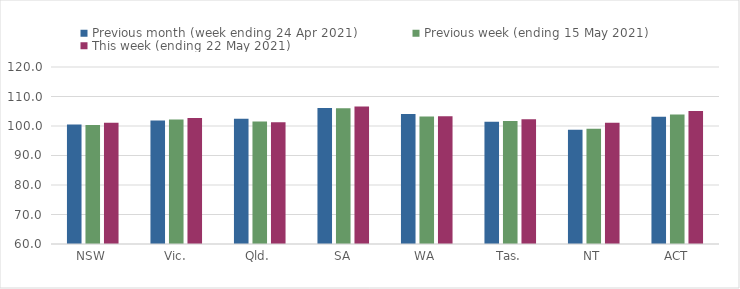
| Category | Previous month (week ending 24 Apr 2021) | Previous week (ending 15 May 2021) | This week (ending 22 May 2021) |
|---|---|---|---|
| NSW | 100.48 | 100.33 | 101.13 |
| Vic. | 101.85 | 102.24 | 102.7 |
| Qld. | 102.45 | 101.51 | 101.28 |
| SA | 106.06 | 106 | 106.59 |
| WA | 104.03 | 103.25 | 103.29 |
| Tas. | 101.46 | 101.67 | 102.31 |
| NT | 98.76 | 99.11 | 101.1 |
| ACT | 103.11 | 103.93 | 105.05 |